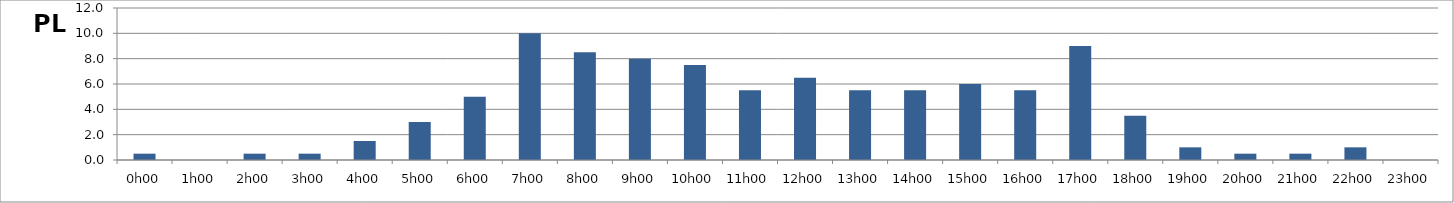
| Category | PL |
|---|---|
| 0.0 | 0.5 |
| 0.041666666666666664 | 0 |
| 0.08333333333333333 | 0.5 |
| 0.125 | 0.5 |
| 0.16666666666666666 | 1.5 |
| 0.20833333333333334 | 3 |
| 0.25 | 5 |
| 0.2916666666666667 | 10 |
| 0.3333333333333333 | 8.5 |
| 0.375 | 8 |
| 0.4166666666666667 | 7.5 |
| 0.4583333333333333 | 5.5 |
| 0.5 | 6.5 |
| 0.5416666666666666 | 5.5 |
| 0.5833333333333334 | 5.5 |
| 0.625 | 6 |
| 0.6666666666666666 | 5.5 |
| 0.7083333333333334 | 9 |
| 0.75 | 3.5 |
| 0.7916666666666666 | 1 |
| 0.8333333333333334 | 0.5 |
| 0.875 | 0.5 |
| 0.9166666666666666 | 1 |
| 0.9583333333333334 | 0 |